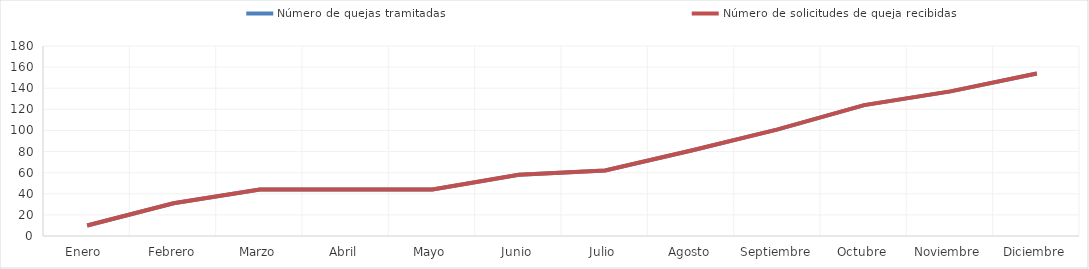
| Category | Número de quejas tramitadas | Número de solicitudes de queja recibidas |
|---|---|---|
| Enero  | 10 | 10 |
| Febrero | 31 | 31 |
| Marzo | 44 | 44 |
| Abril | 44 | 44 |
| Mayo | 44 | 44 |
| Junio | 58 | 58 |
| Julio | 62 | 62 |
| Agosto | 81 | 81 |
| Septiembre | 101 | 101 |
| Octubre | 124 | 124 |
| Noviembre | 137 | 137 |
| Diciembre | 154 | 154 |